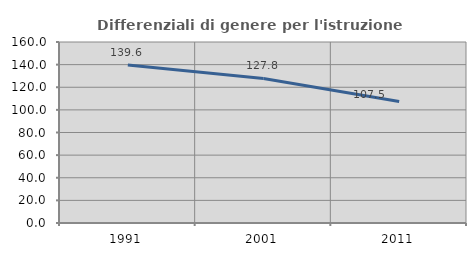
| Category | Differenziali di genere per l'istruzione superiore |
|---|---|
| 1991.0 | 139.573 |
| 2001.0 | 127.754 |
| 2011.0 | 107.483 |